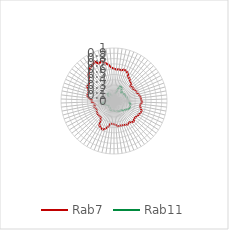
| Category | Rab7 | Rab11 |
|---|---|---|
| 0.0 | 0.612 | 0.109 |
| 0.10913 | 0.593 | 0.129 |
| 0.21825 | 0.608 | 0.142 |
| 0.32738 | 0.595 | 0.167 |
| 0.43651 | 0.622 | 0.231 |
| 0.54563 | 0.612 | 0.295 |
| 0.65476 | 0.585 | 0.302 |
| 0.76389 | 0.527 | 0.282 |
| 0.87302 | 0.511 | 0.236 |
| 0.98214 | 0.473 | 0.208 |
| 1.09127 | 0.465 | 0.226 |
| 1.2004 | 0.416 | 0.235 |
| 1.30952 | 0.44 | 0.227 |
| 1.41865 | 0.422 | 0.231 |
| 1.52778 | 0.447 | 0.236 |
| 1.6369 | 0.456 | 0.24 |
| 1.74603 | 0.459 | 0.24 |
| 1.85516 | 0.478 | 0.257 |
| 1.96429 | 0.499 | 0.264 |
| 2.07341 | 0.509 | 0.255 |
| 2.18254 | 0.513 | 0.261 |
| 2.29167 | 0.533 | 0.286 |
| 2.40079 | 0.505 | 0.291 |
| 2.50992 | 0.498 | 0.319 |
| 2.61905 | 0.525 | 0.317 |
| 2.72817 | 0.557 | 0.318 |
| 2.8373 | 0.546 | 0.322 |
| 2.94643 | 0.534 | 0.314 |
| 3.05556 | 0.522 | 0.293 |
| 3.16468 | 0.506 | 0.268 |
| 3.27381 | 0.505 | 0.261 |
| 3.38294 | 0.538 | 0.248 |
| 3.49206 | 0.518 | 0.225 |
| 3.60119 | 0.492 | 0.227 |
| 3.71032 | 0.514 | 0.216 |
| 3.81944 | 0.5 | 0.221 |
| 3.92857 | 0.488 | 0.209 |
| 4.0377 | 0.485 | 0.21 |
| 4.14683 | 0.478 | 0.199 |
| 4.25595 | 0.483 | 0.19 |
| 4.36508 | 0.45 | 0.186 |
| 4.47421 | 0.44 | 0.178 |
| 4.58333 | 0.432 | 0.177 |
| 4.69246 | 0.436 | 0.176 |
| 4.80159 | 0.501 | 0.184 |
| 4.91071 | 0.55 | 0.182 |
| 5.01984 | 0.58 | 0.179 |
| 5.12897 | 0.558 | 0.165 |
| 5.2381 | 0.544 | 0.145 |
| 5.34722 | 0.437 | 0.16 |
| 5.45635 | 0.393 | 0.146 |
| 5.56548 | 0.393 | 0.138 |
| 5.6746 | 0.395 | 0.128 |
| 5.78373 | 0.393 | 0.138 |
| 5.89286 | 0.383 | 0.143 |
| 6.00198 | 0.371 | 0.144 |
| 6.11111 | 0.362 | 0.161 |
| 6.22024 | 0.373 | 0.171 |
| 6.32937 | 0.394 | 0.218 |
| 6.43849 | 0.357 | 0.249 |
| 6.54762 | 0.385 | 0.228 |
| 6.65675 | 0.422 | 0.153 |
| 6.76587 | 0.418 | 0.131 |
| 6.875 | 0.471 | 0.089 |
| 6.98413 | 0.514 | 0.067 |
| 7.09325 | 0.517 | 0.064 |
| 7.20238 | 0.499 | 0.055 |
| 7.31151 | 0.536 | 0.059 |
| 7.42063 | 0.576 | 0.067 |
| 7.52976 | 0.566 | 0.079 |
| 7.63889 | 0.593 | 0.101 |
| 7.74802 | 0.63 | 0.146 |
| 7.85714 | 0.693 | 0.177 |
| 7.96627 | 0.738 | 0.184 |
| 8.0754 | 0.775 | 0.173 |
| 8.18452 | 0.786 | 0.153 |
| 8.29365 | 0.832 | 0.134 |
| 8.40278 | 0.76 | 0.114 |
| 8.5119 | 0.788 | 0.104 |
| 8.62103 | 0.741 | 0.106 |
| 8.73016 | 0.693 | 0.094 |
| 8.83929 | 0.63 | 0.089 |